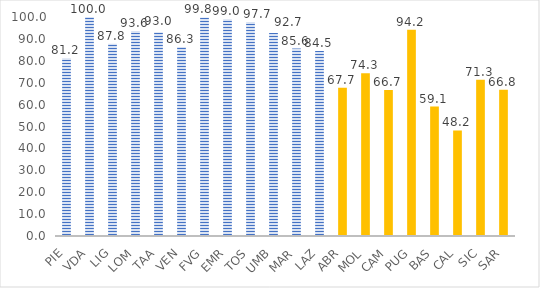
| Category | nidi e sezioni primavera |
|---|---|
| PIE | 81.2 |
| VDA | 100 |
| LIG | 87.8 |
| LOM | 93.6 |
| TAA | 93 |
| VEN | 86.3 |
| FVG | 99.8 |
| EMR | 99 |
| TOS | 97.7 |
| UMB | 92.7 |
| MAR | 85.6 |
| LAZ | 84.5 |
| ABR | 67.7 |
| MOL | 74.3 |
| CAM | 66.7 |
| PUG | 94.2 |
| BAS | 59.1 |
| CAL | 48.2 |
| SIC | 71.3 |
| SAR | 66.8 |